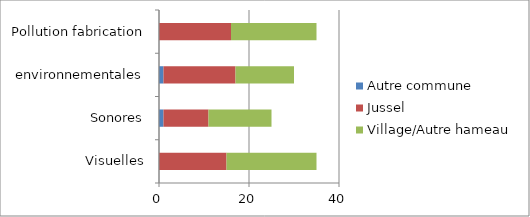
| Category | Autre commune | Jussel | Village/Autre hameau |
|---|---|---|---|
| Visuelles | 0 | 15 | 20 |
| Sonores | 1 | 10 | 14 |
| environnementales | 1 | 16 | 13 |
| Pollution fabrication | 0 | 16 | 19 |